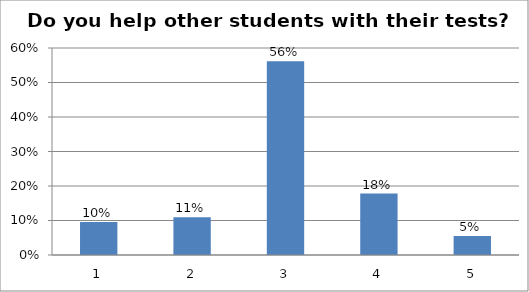
| Category | Series 0 |
|---|---|
| 0 | 0.096 |
| 1 | 0.11 |
| 2 | 0.562 |
| 3 | 0.178 |
| 4 | 0.055 |